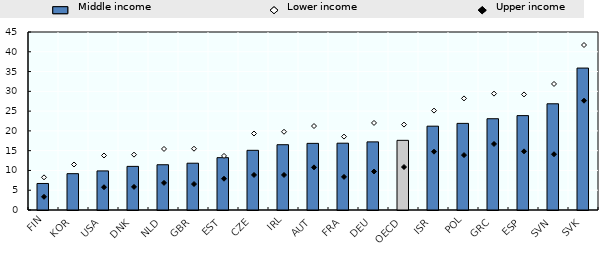
| Category | Middle income |
|---|---|
| FIN | 6.706 |
| KOR | 9.185 |
| USA | 9.881 |
| DNK | 11.028 |
| NLD | 11.441 |
| GBR | 11.83 |
| EST | 13.232 |
| CZE | 15.089 |
| IRL | 16.507 |
| AUT | 16.844 |
| FRA | 16.888 |
| DEU | 17.221 |
| OECD | 17.613 |
| ISR | 21.189 |
| POL | 21.899 |
| GRC | 23.073 |
| ESP | 23.86 |
| SVN | 26.852 |
| SVK | 35.881 |